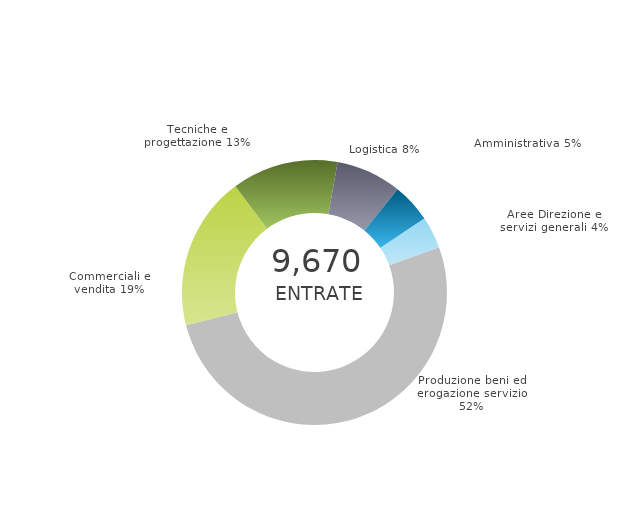
| Category | Series 0 | Series 1 |
|---|---|---|
| Produzione beni ed erogazione servizio | 0 | 0.516 |
| Commerciali e vendita | 0 | 0.188 |
| Tecniche e progettazione | 0 | 0.13 |
| Logistica | 0 | 0.08 |
| Amministrativa | 0 | 0.048 |
| Aree Direzione e servizi generali | 0 | 0.039 |